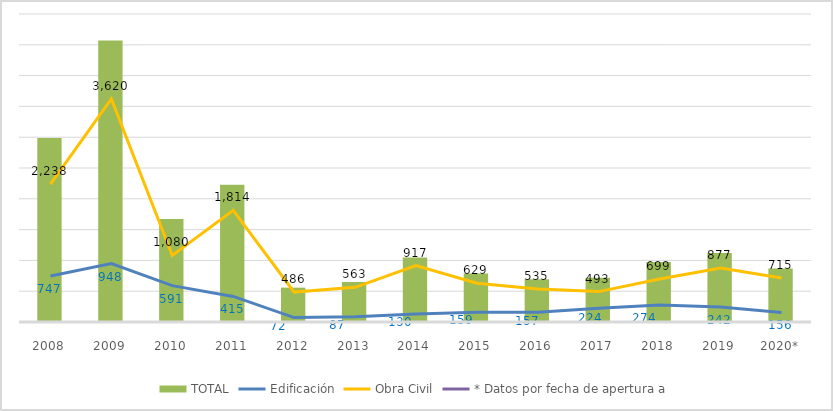
| Category | TOTAL |
|---|---|
| 2008 | 2985.002 |
| 2009 | 4567.868 |
| 2010 | 1671.018 |
| 2011 | 2229.383 |
| 2012 | 557.774 |
| 2013 | 650.312 |
| 2014 | 1046.781 |
| 2015 | 788.142 |
| 2016 | 692.431 |
| 2017 | 717.31 |
| 2018 | 973 |
| 2019 | 1119.269 |
| 2020* | 870.446 |